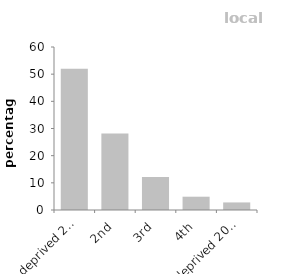
| Category | local authority |
|---|---|
| most deprived 20% | 52.003 |
| 2nd | 28.179 |
| 3rd | 12.138 |
| 4th | 4.896 |
| least deprived 20% | 2.785 |